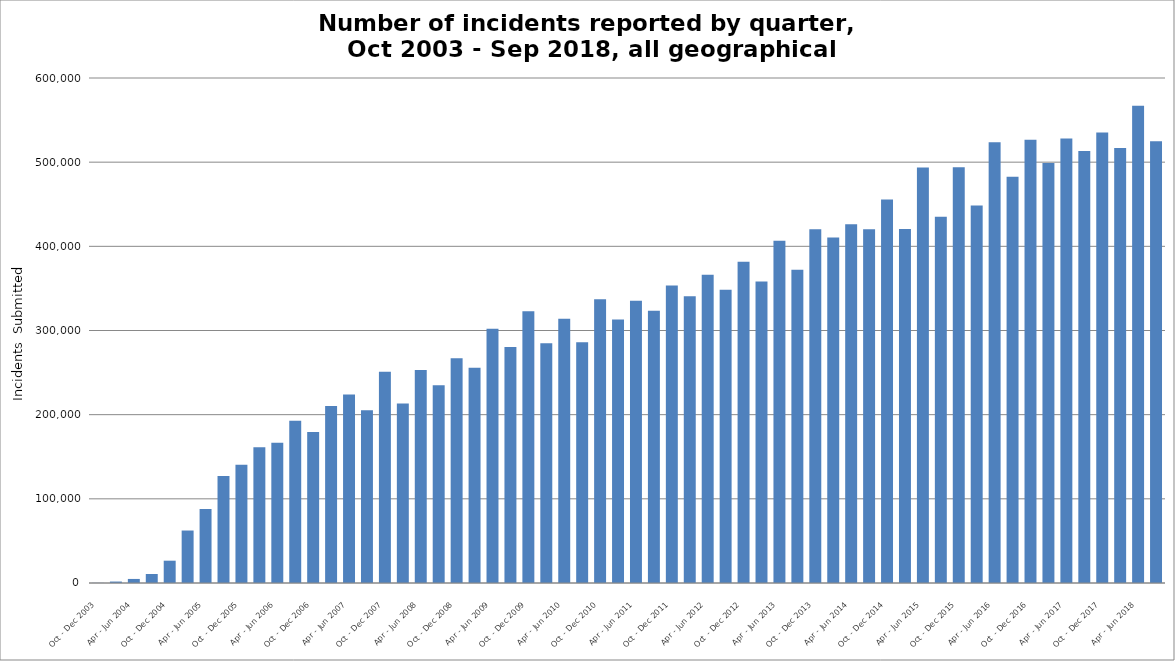
| Category | *All geographical locations |
|---|---|
| Oct - Dec 2003 | 158 |
| Jan - Mar 2004 | 1716 |
| Apr - Jun 2004 | 4823 |
| Jul - Sep 2004 | 10720 |
| Oct - Dec 2004 | 26508 |
| Jan - Mar 2005 | 62351 |
| Apr - Jun 2005 | 88042 |
| Jul - Sep 2005 | 127170 |
| Oct - Dec 2005 | 140394 |
| Jan - Mar 2006 | 161141 |
| Apr - Jun 2006 | 166539 |
| Jul - Sep 2006 | 192794 |
| Oct - Dec 2006 | 179538 |
| Jan - Mar 2007 | 210178 |
| Apr - Jun 2007 | 224047 |
| Jul - Sep 2007 | 205357 |
| Oct - Dec 2007 | 251010 |
| Jan - Mar 2008 | 213281 |
| Apr - Jun 2008 | 253006 |
| Jul - Sep 2008 | 234863 |
| Oct - Dec 2008 | 267135 |
| Jan - Mar 2009 | 255837 |
| Apr - Jun 2009 | 302198 |
| Jul - Sep 2009 | 280454 |
| Oct - Dec 2009 | 322757 |
| Jan - Mar 2010 | 284962 |
| Apr - Jun 2010 | 313827 |
| Jul - Sep 2010 | 286096 |
| Oct - Dec 2010 | 337149 |
| Jan - Mar 2011 | 312982 |
| Apr - Jun 2011 | 335327 |
| Jul - Sep 2011 | 323427 |
| Oct - Dec 2011 | 353578 |
| Jan - Mar 2012 | 340826 |
| Apr - Jun 2012 | 366262 |
| Jul - Sep 2012 | 348341 |
| Oct - Dec 2012 | 381754 |
| Jan - Mar 2013 | 358099 |
| Apr - Jun 2013 | 406617 |
| Jul - Sep 2013 | 372099 |
| Oct - Dec 2013 | 420297 |
| Jan - Mar 2014 | 410408 |
| Apr - Jun 2014 | 426315 |
| Jul - Sep 2014 | 420333 |
| Oct - Dec 2014 | 455584 |
| Jan - Mar 2015 | 420510 |
| Apr - Jun 2015 | 493795 |
| Jul - Sep 2015 | 435245 |
| Oct - Dec 2015 | 494082 |
| Jan - Mar 2016 | 448659 |
| Apr - Jun 2016 | 523610 |
| Jul - Sep 2016 | 482727 |
| Oct - Dec 2016 | 526580 |
| Jan - Mar 2017 | 499023 |
| Apr - Jun 2017 | 528164 |
| Jul - Sep 2017 | 513153 |
| Oct - Dec 2017 | 535229 |
| Jan - Mar 2018 | 516918 |
| Apr - Jun 2018 | 566898 |
| Jul - Sep 2018 | 524805 |